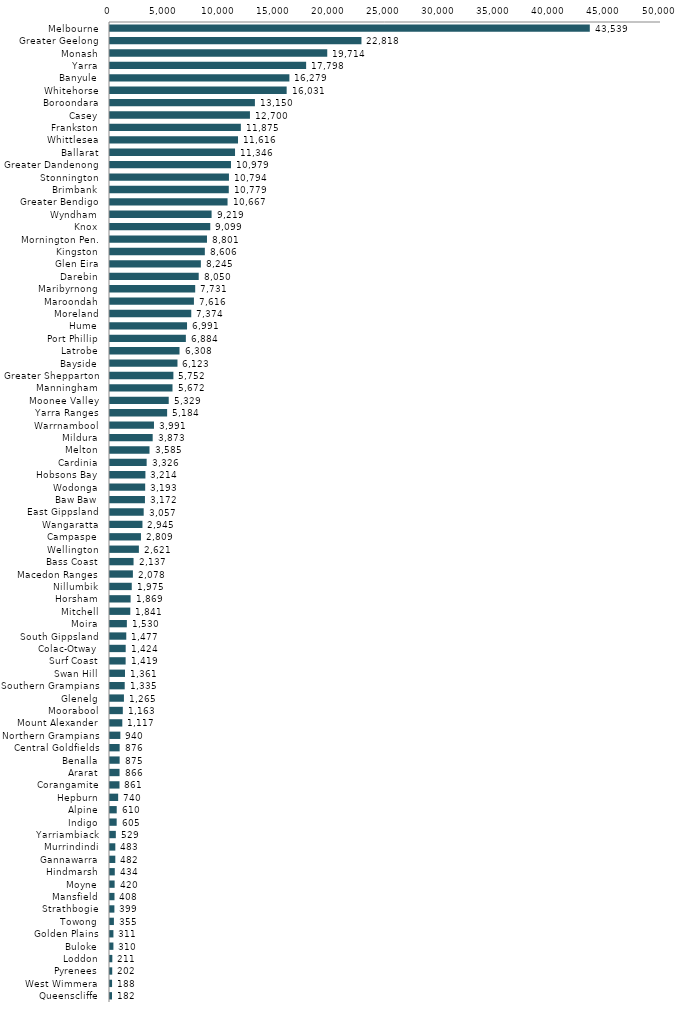
| Category | Series 0 |
|---|---|
| Melbourne | 43539 |
| Greater Geelong | 22818 |
| Monash | 19714 |
| Yarra | 17798 |
| Banyule | 16279 |
| Whitehorse | 16031 |
| Boroondara | 13150 |
| Casey | 12700 |
| Frankston | 11875 |
| Whittlesea | 11616 |
| Ballarat | 11346 |
| Greater Dandenong | 10979 |
| Stonnington | 10794 |
| Brimbank | 10779 |
| Greater Bendigo | 10667 |
| Wyndham | 9219 |
| Knox | 9099 |
| Mornington Pen. | 8801 |
| Kingston | 8606 |
| Glen Eira | 8245 |
| Darebin | 8050 |
| Maribyrnong | 7731 |
| Maroondah | 7616 |
| Moreland | 7374 |
| Hume | 6991 |
| Port Phillip | 6884 |
| Latrobe | 6308 |
| Bayside | 6123 |
| Greater Shepparton | 5752 |
| Manningham | 5672 |
| Moonee Valley | 5329 |
| Yarra Ranges | 5184 |
| Warrnambool | 3991 |
| Mildura | 3873 |
| Melton | 3585 |
| Cardinia | 3326 |
| Hobsons Bay | 3214 |
| Wodonga | 3193 |
| Baw Baw | 3172 |
| East Gippsland | 3057 |
| Wangaratta | 2945 |
| Campaspe | 2809 |
| Wellington | 2621 |
| Bass Coast | 2137 |
| Macedon Ranges | 2078 |
| Nillumbik | 1975 |
| Horsham | 1869 |
| Mitchell | 1841 |
| Moira | 1530 |
| South Gippsland | 1477 |
| Colac-Otway | 1424 |
| Surf Coast | 1419 |
| Swan Hill | 1361 |
| Southern Grampians | 1335 |
| Glenelg | 1265 |
| Moorabool | 1163 |
| Mount Alexander | 1117 |
| Northern Grampians | 940 |
| Central Goldfields | 876 |
| Benalla | 875 |
| Ararat | 866 |
| Corangamite | 861 |
| Hepburn | 740 |
| Alpine | 610 |
| Indigo | 605 |
| Yarriambiack | 529 |
| Murrindindi | 483 |
| Gannawarra | 482 |
| Hindmarsh | 434 |
| Moyne | 420 |
| Mansfield | 408 |
| Strathbogie | 399 |
| Towong | 355 |
| Golden Plains | 311 |
| Buloke | 310 |
| Loddon | 211 |
| Pyrenees | 202 |
| West Wimmera | 188 |
| Queenscliffe | 182 |